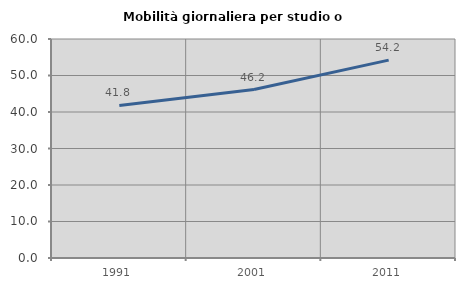
| Category | Mobilità giornaliera per studio o lavoro |
|---|---|
| 1991.0 | 41.783 |
| 2001.0 | 46.163 |
| 2011.0 | 54.204 |